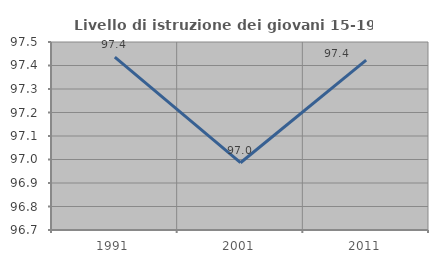
| Category | Livello di istruzione dei giovani 15-19 anni |
|---|---|
| 1991.0 | 97.436 |
| 2001.0 | 96.986 |
| 2011.0 | 97.423 |